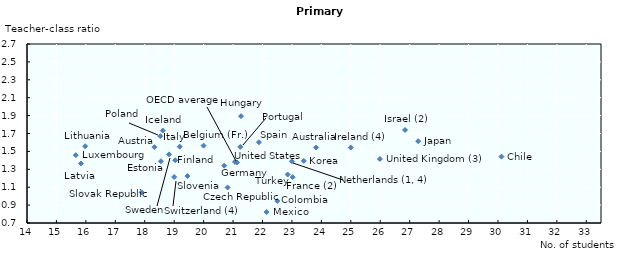
| Category | Teacher-class ratio |
|---|---|
| 23.821239207436 | 1.544 |
| 18.327947845805 | 1.548 |
| 20.0 | 1.564 |
| 30.117864878083 | 1.442 |
| 20.814129248676 | 1.097 |
| 18.551263362488 | 1.39 |
| 19.035396754834 | 1.401 |
| 23.024706779717 | 1.212 |
| 20.700642709771 | 1.34 |
| 21.271355681132 | 1.893 |
| 18.613398893669 | 1.733 |
| 25.0 | 1.543 |
| 26.842344188392 | 1.739 |
| 19.187102918169 | 1.553 |
| 27.289008468 | 1.614 |
| 23.403500082549 | 1.394 |
| 15.832501012282 | 1.365 |
| 15.658238884045 | 1.458 |
| 22.137677146467 | 0.822 |
| 23.0 | 1.389 |
| 18.529292884029 | 1.671 |
| 21.245349122377 | 1.55 |
| 17.893431812187 | 1.043 |
| 19.450543847723 | 1.224 |
| 21.877851477901 | 1.602 |
| 18.824361699031 | 1.467 |
| 19.0 | 1.214 |
| 22.855610699865 | 1.242 |
| 25.988224152672 | 1.416 |
| 21.135693980904 | 1.377 |
| 21.06416678458143 | 1.383 |
| 22.502473302503 | 0.946 |
| 15.975529692629 | 1.558 |